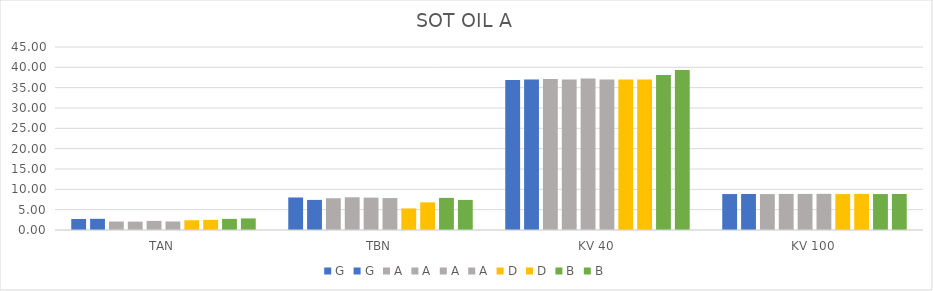
| Category | G | A | D | B |
|---|---|---|---|---|
| TAN | 2.75 | 2.1 | 2.5 | 2.85 |
| TBN | 7.4 | 7.85 | 6.8 | 7.4 |
| KV 40 | 37 | 36.98 | 37 | 39.36 |
| KV 100 | 8.86 | 8.89 | 8.88 | 8.85 |